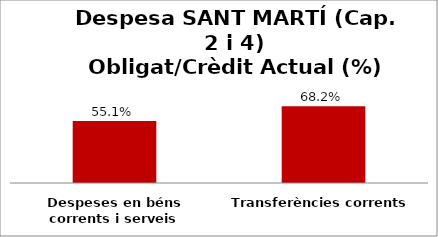
| Category | Series 0 |
|---|---|
| Despeses en béns corrents i serveis | 0.551 |
| Transferències corrents | 0.682 |